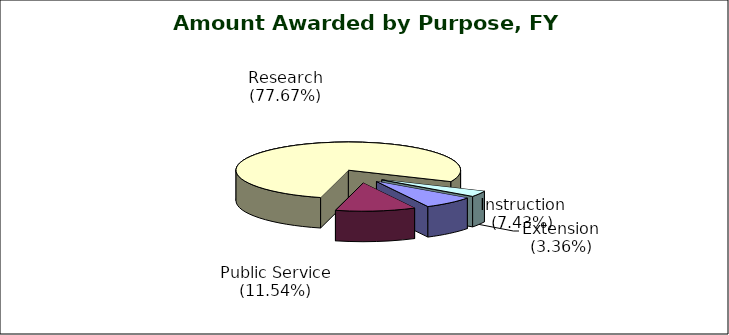
| Category | Series 0 |
|---|---|
| Instruction (7.43%) | 0.074 |
| Public Service (11.54%) | 0.115 |
| Research (77.67%) | 0.777 |
| Extension (3.36%) | 0.034 |